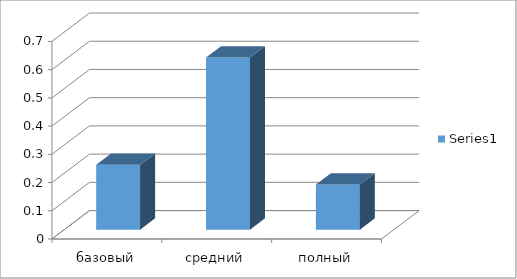
| Category | Series 0 |
|---|---|
| базовый | 0.23 |
| средний | 0.61 |
| полный | 0.16 |